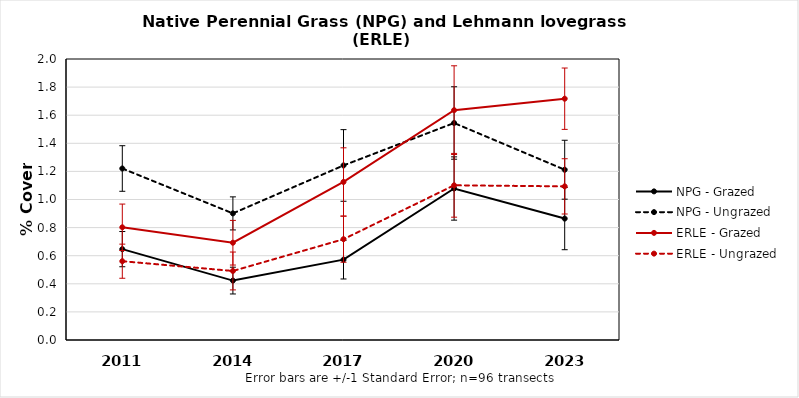
| Category | NPG - Grazed | NPG - Ungrazed | ERLE - Grazed | ERLE - Ungrazed |
|---|---|---|---|---|
| 2011.0 | 0.647 | 1.221 | 0.802 | 0.561 |
| 2014.0 | 0.423 | 0.901 | 0.692 | 0.491 |
| 2017.0 | 0.572 | 1.242 | 1.125 | 0.717 |
| 2020.0 | 1.078 | 1.545 | 1.636 | 1.101 |
| 2023.0 | 0.864 | 1.212 | 1.717 | 1.093 |